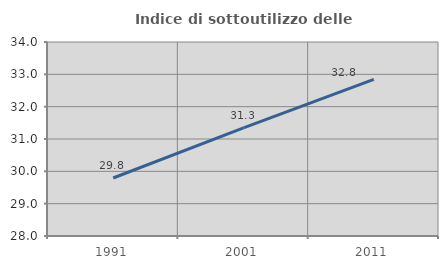
| Category | Indice di sottoutilizzo delle abitazioni  |
|---|---|
| 1991.0 | 29.795 |
| 2001.0 | 31.343 |
| 2011.0 | 32.841 |